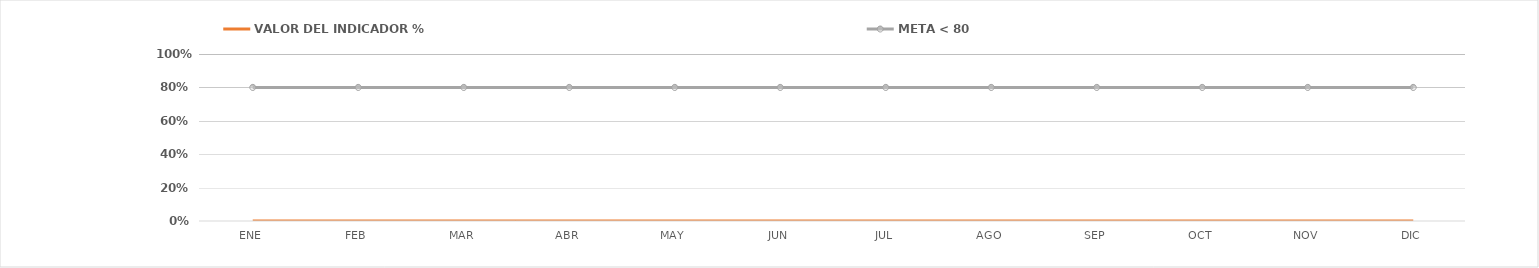
| Category | VALOR DEL INDICADOR % | META < 80 |
|---|---|---|
| ENE | 0 | 0.8 |
| FEB | 0 | 0.8 |
| MAR | 0 | 0.8 |
| ABR | 0 | 0.8 |
| MAY | 0 | 0.8 |
| JUN | 0 | 0.8 |
| JUL | 0 | 0.8 |
| AGO | 0 | 0.8 |
| SEP | 0 | 0.8 |
| OCT | 0 | 0.8 |
| NOV | 0 | 0.8 |
| DIC | 0 | 0.8 |